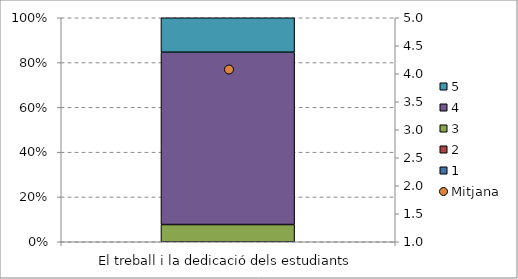
| Category | 1 | 2 | 3 | 4 | 5 |
|---|---|---|---|---|---|
| El treball i la dedicació dels estudiants | 0 | 0 | 0.077 | 0.769 | 0.154 |